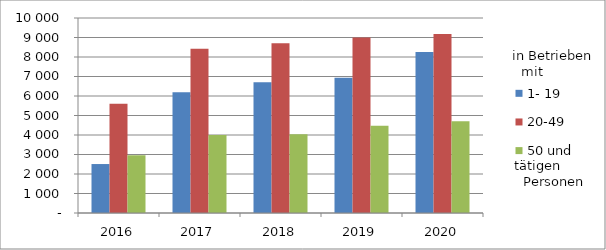
| Category | 1- 19 | 20-49 | 50 und mehr |
|---|---|---|---|
| 2016.0 | 2511 | 5598 | 2967 |
| 2017.0 | 6188 | 8425 | 4004 |
| 2018.0 | 6705 | 8702 | 4036 |
| 2019.0 | 6930 | 9003 | 4480 |
| 2020.0 | 8255 | 9178 | 4705 |